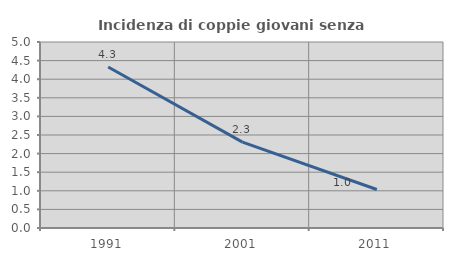
| Category | Incidenza di coppie giovani senza figli |
|---|---|
| 1991.0 | 4.327 |
| 2001.0 | 2.308 |
| 2011.0 | 1.034 |